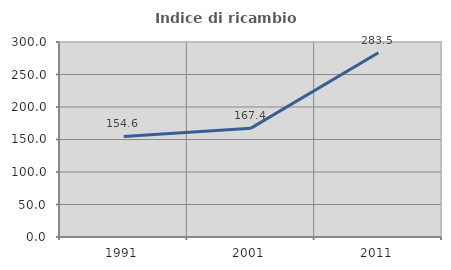
| Category | Indice di ricambio occupazionale  |
|---|---|
| 1991.0 | 154.618 |
| 2001.0 | 167.442 |
| 2011.0 | 283.511 |